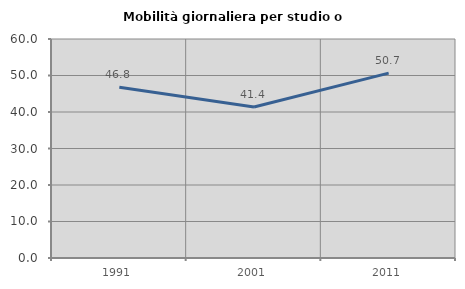
| Category | Mobilità giornaliera per studio o lavoro |
|---|---|
| 1991.0 | 46.761 |
| 2001.0 | 41.366 |
| 2011.0 | 50.656 |